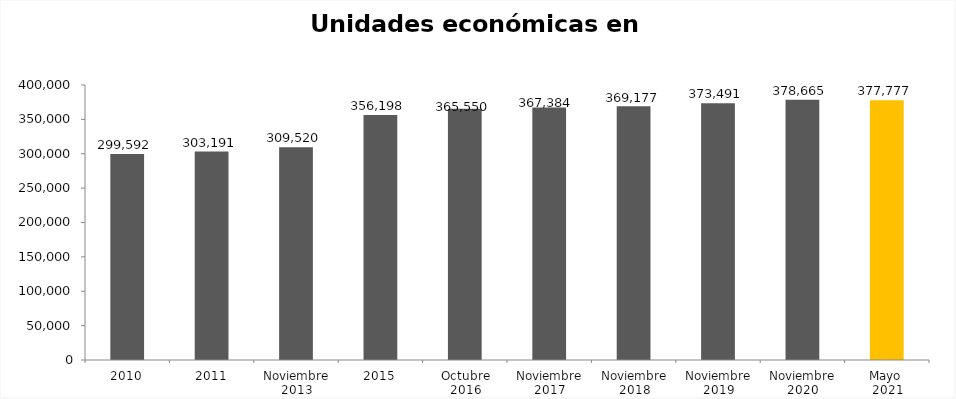
| Category | TOTAL |
|---|---|
| 2010 | 299592 |
| 2011 | 303191 |
| Noviembre 2013 | 309520 |
| 2015 | 356198 |
| Octubre 2016 | 365550 |
| Noviembre 2017 | 367384 |
| Noviembre 2018 | 369177 |
| Noviembre 2019 | 373491 |
| Noviembre 2020 | 378665 |
| Mayo 
2021 | 377777 |